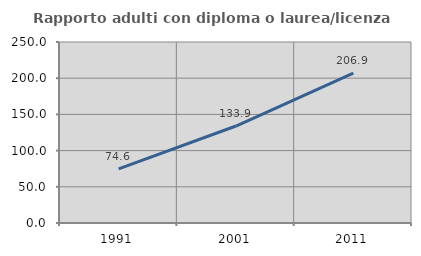
| Category | Rapporto adulti con diploma o laurea/licenza media  |
|---|---|
| 1991.0 | 74.642 |
| 2001.0 | 133.949 |
| 2011.0 | 206.892 |